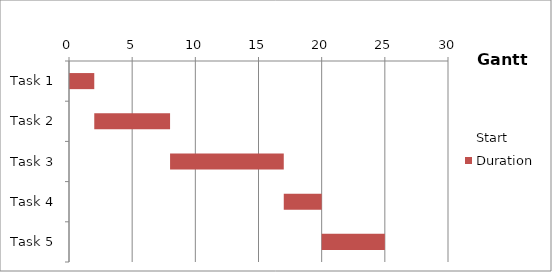
| Category | Start | Duration |
|---|---|---|
| Task 1 | 0 | 2 |
| Task 2 | 2 | 6 |
| Task 3 | 8 | 9 |
| Task 4 | 17 | 3 |
| Task 5 | 20 | 5 |